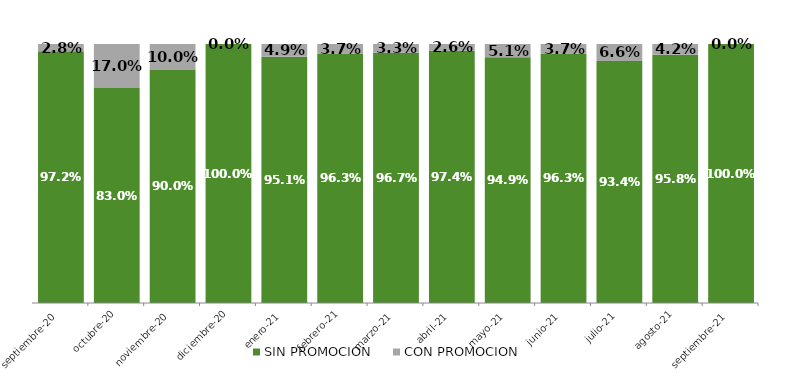
| Category | SIN PROMOCION   | CON PROMOCION   |
|---|---|---|
| 2020-09-01 | 0.972 | 0.028 |
| 2020-10-01 | 0.83 | 0.17 |
| 2020-11-01 | 0.9 | 0.1 |
| 2020-12-01 | 1 | 0 |
| 2021-01-01 | 0.951 | 0.049 |
| 2021-02-01 | 0.963 | 0.037 |
| 2021-03-01 | 0.967 | 0.033 |
| 2021-04-01 | 0.974 | 0.026 |
| 2021-05-01 | 0.949 | 0.051 |
| 2021-06-01 | 0.963 | 0.037 |
| 2021-07-01 | 0.934 | 0.066 |
| 2021-08-01 | 0.958 | 0.042 |
| 2021-09-01 | 1 | 0 |